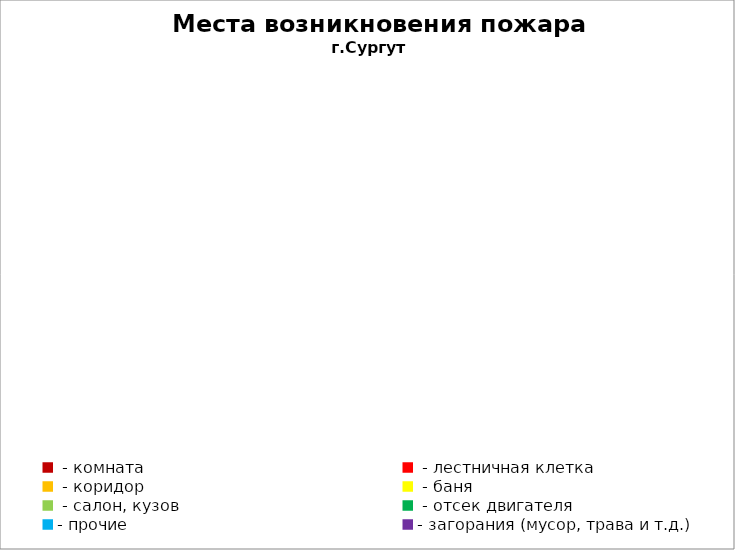
| Category | Места возникновения пожара |
|---|---|
|  - комната | 49 |
|  - лестничная клетка | 19 |
|  - коридор | 9 |
|  - баня | 22 |
|  - салон, кузов | 10 |
|  - отсек двигателя | 26 |
| - прочие | 102 |
| - загорания (мусор, трава и т.д.)  | 160 |